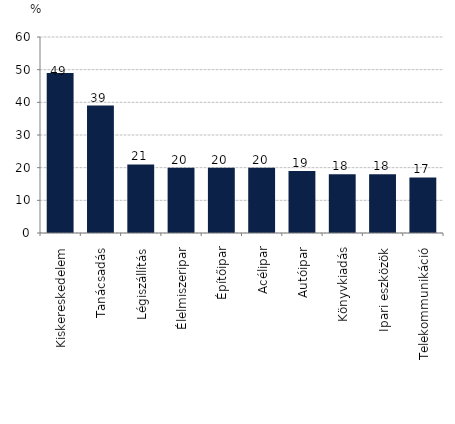
| Category | 10%-os adatfelhasználhatóság növekedés hatása a termelékenységre (árbevétel/fő) |
|---|---|
| Kiskereskedelem | 49 |
| Tanácsadás | 39 |
| Légiszállítás | 21 |
| Élelmiszeripar | 20 |
| Építőipar | 20 |
| Acélipar | 20 |
| Autóipar | 19 |
| Könyvkiadás | 18 |
| Ipari eszközök | 18 |
| Telekommunikáció | 17 |